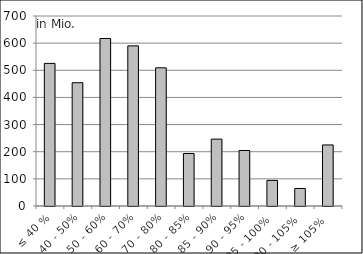
| Category | Volumen |
|---|---|
| ≤ 40 % | 525312786.38 |
| 40 - 50% | 454209567.07 |
| 50 - 60% | 617161752.41 |
| 60 - 70% | 589987371.76 |
| 70 - 80% | 509102721.36 |
| 80 - 85% | 193454938.22 |
| 85 - 90% | 246386553.3 |
| 90 - 95% | 204510176.39 |
| 95 - 100% | 94270588.32 |
| 100 - 105% | 64551247.94 |
| ≥ 105% | 224937186.69 |